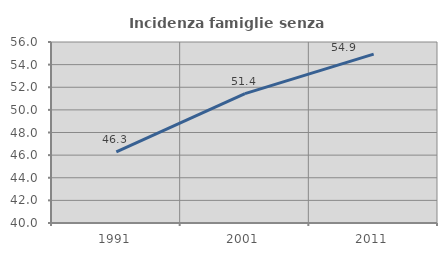
| Category | Incidenza famiglie senza nuclei |
|---|---|
| 1991.0 | 46.286 |
| 2001.0 | 51.432 |
| 2011.0 | 54.928 |